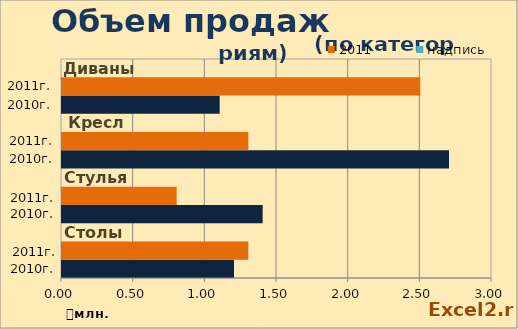
| Category | 2010 | 2011 | надпись |
|---|---|---|---|
| Столы | 1.2 | 1.3 | 0 |
| Стулья | 1.4 | 0.8 | 0 |
| Кресла | 2.7 | 1.3 | 0 |
| Диваны | 1.1 | 2.5 | 0 |